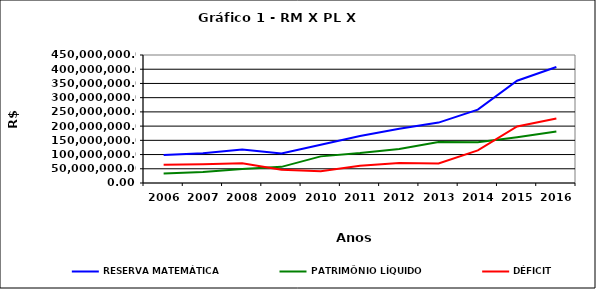
| Category | RESERVA MATEMÁTICA | PATRIMÔNIO LÍQUIDO | DÉFICIT |
|---|---|---|---|
| 2006.0 | 98025825.582 | 33581341.11 | 64444484.472 |
| 2007.0 | 104975534.212 | 38861557.44 | 66113976.772 |
| 2008.0 | 118072511.526 | 49006564.06 | 69065947.466 |
| 2009.0 | 103541306.335 | 56797290.63 | 46744015.705 |
| 2010.0 | 134714970.51 | 93638973.63 | 41075996.88 |
| 2011.0 | 165531872.464 | 105103991.53 | 60427880.934 |
| 2012.0 | 190427491.161 | 119705343.11 | 70722148.051 |
| 2013.0 | 212310357.413 | 143908475.19 | 68401882.223 |
| 2014.0 | 257916448.865 | 143180886.02 | 114735562.845 |
| 2015.0 | 359610425.356 | 160854462.92 | 198755962.436 |
| 2016.0 | 408047231.497 | 181232209.73 | 226815021.767 |